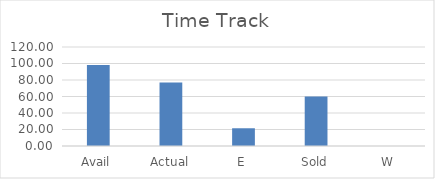
| Category | Series 0 |
|---|---|
| Avail | 98.3 |
| Actual | 76.82 |
| E | 21.5 |
| Sold | 60.15 |
| W | 0 |